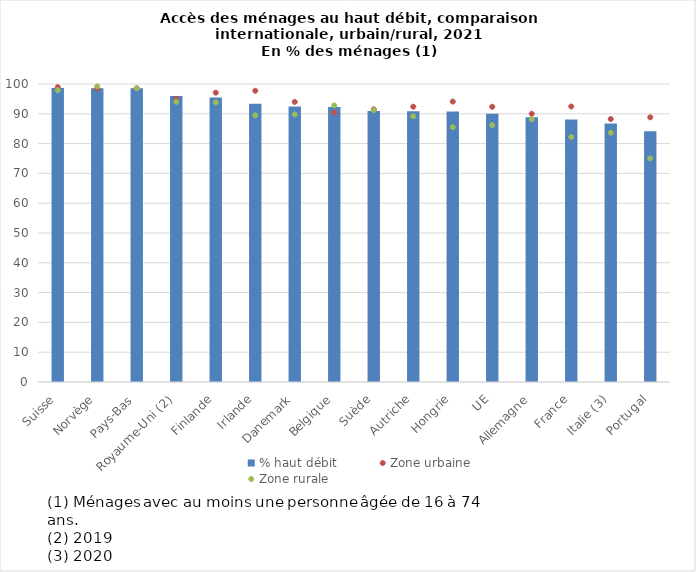
| Category | % haut débit |
|---|---|
| Suisse | 98.673 |
| Norvège | 98.601 |
| Pays-Bas | 98.557 |
| Royaume-Uni (2) | 96 |
| Finlande | 95.475 |
| Irlande | 93.349 |
| Danemark | 92.466 |
| Belgique | 92.3 |
| Suède | 90.963 |
| Autriche | 90.891 |
| Hongrie | 90.781 |
| UE | 89.977 |
| Allemagne | 88.838 |
| France | 88.114 |
| Italie (3) | 86.752 |
| Portugal | 84.104 |